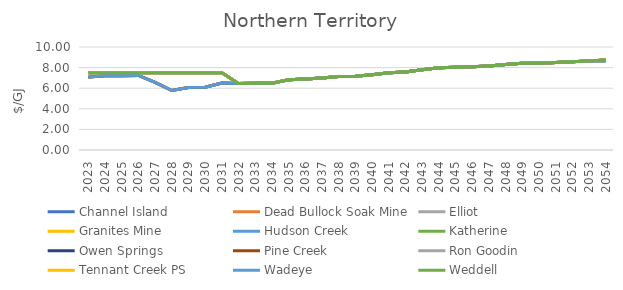
| Category | Channel Island | Dead Bullock Soak Mine | Elliot | Granites Mine | Hudson Creek | Katherine | Owen Springs | Pine Creek | Ron Goodin | Tennant Creek PS | Wadeye | Weddell |
|---|---|---|---|---|---|---|---|---|---|---|---|---|
| 2023.0 | 7.5 | 7.075 | 7.075 | 7.075 | 7.075 | 7.5 | 7.5 | 7.075 | 7.5 | 7.5 | 7.075 | 7.5 |
| 2024.0 | 7.5 | 7.209 | 7.209 | 7.209 | 7.209 | 7.5 | 7.5 | 7.209 | 7.5 | 7.5 | 7.209 | 7.5 |
| 2025.0 | 7.5 | 7.206 | 7.206 | 7.206 | 7.206 | 7.5 | 7.5 | 7.206 | 7.5 | 7.5 | 7.206 | 7.5 |
| 2026.0 | 7.5 | 7.235 | 7.235 | 7.235 | 7.235 | 7.5 | 7.5 | 7.235 | 7.5 | 7.5 | 7.235 | 7.5 |
| 2027.0 | 7.5 | 6.574 | 6.574 | 6.574 | 6.574 | 7.5 | 7.5 | 6.574 | 7.5 | 7.5 | 6.574 | 7.5 |
| 2028.0 | 7.5 | 5.778 | 5.778 | 5.778 | 5.778 | 7.5 | 7.5 | 5.778 | 7.5 | 7.5 | 5.778 | 7.5 |
| 2029.0 | 7.5 | 6.058 | 6.058 | 6.058 | 6.058 | 7.5 | 7.5 | 6.058 | 7.5 | 7.5 | 6.058 | 7.5 |
| 2030.0 | 7.5 | 6.086 | 6.086 | 6.086 | 6.086 | 7.5 | 7.5 | 6.086 | 7.5 | 7.5 | 6.086 | 7.5 |
| 2031.0 | 7.5 | 6.501 | 6.501 | 6.501 | 6.501 | 7.5 | 7.5 | 6.501 | 7.5 | 7.5 | 6.501 | 7.5 |
| 2032.0 | 6.461 | 6.461 | 6.461 | 6.461 | 6.461 | 6.461 | 6.461 | 6.461 | 6.461 | 6.461 | 6.461 | 6.461 |
| 2033.0 | 6.474 | 6.474 | 6.474 | 6.474 | 6.474 | 6.474 | 6.474 | 6.474 | 6.474 | 6.474 | 6.474 | 6.474 |
| 2034.0 | 6.492 | 6.492 | 6.492 | 6.492 | 6.492 | 6.492 | 6.492 | 6.492 | 6.492 | 6.492 | 6.492 | 6.492 |
| 2035.0 | 6.823 | 6.823 | 6.823 | 6.823 | 6.823 | 6.823 | 6.823 | 6.823 | 6.823 | 6.823 | 6.823 | 6.823 |
| 2036.0 | 6.9 | 6.9 | 6.9 | 6.9 | 6.9 | 6.9 | 6.9 | 6.9 | 6.9 | 6.9 | 6.9 | 6.9 |
| 2037.0 | 7.001 | 7.001 | 7.001 | 7.001 | 7.001 | 7.001 | 7.001 | 7.001 | 7.001 | 7.001 | 7.001 | 7.001 |
| 2038.0 | 7.128 | 7.128 | 7.128 | 7.128 | 7.128 | 7.128 | 7.128 | 7.128 | 7.128 | 7.128 | 7.128 | 7.128 |
| 2039.0 | 7.169 | 7.169 | 7.169 | 7.169 | 7.169 | 7.169 | 7.169 | 7.169 | 7.169 | 7.169 | 7.169 | 7.169 |
| 2040.0 | 7.308 | 7.308 | 7.308 | 7.308 | 7.308 | 7.308 | 7.308 | 7.308 | 7.308 | 7.308 | 7.308 | 7.308 |
| 2041.0 | 7.495 | 7.495 | 7.495 | 7.495 | 7.495 | 7.495 | 7.495 | 7.495 | 7.495 | 7.495 | 7.495 | 7.495 |
| 2042.0 | 7.568 | 7.568 | 7.568 | 7.568 | 7.568 | 7.568 | 7.568 | 7.568 | 7.568 | 7.568 | 7.568 | 7.568 |
| 2043.0 | 7.79 | 7.79 | 7.79 | 7.79 | 7.79 | 7.79 | 7.79 | 7.79 | 7.79 | 7.79 | 7.79 | 7.79 |
| 2044.0 | 7.979 | 7.979 | 7.979 | 7.979 | 7.979 | 7.979 | 7.979 | 7.979 | 7.979 | 7.979 | 7.979 | 7.979 |
| 2045.0 | 8.03 | 8.03 | 8.03 | 8.03 | 8.03 | 8.03 | 8.03 | 8.03 | 8.03 | 8.03 | 8.03 | 8.03 |
| 2046.0 | 8.082 | 8.082 | 8.082 | 8.082 | 8.082 | 8.082 | 8.082 | 8.082 | 8.082 | 8.082 | 8.082 | 8.082 |
| 2047.0 | 8.145 | 8.145 | 8.145 | 8.145 | 8.145 | 8.145 | 8.145 | 8.145 | 8.145 | 8.145 | 8.145 | 8.145 |
| 2048.0 | 8.303 | 8.303 | 8.303 | 8.303 | 8.303 | 8.303 | 8.303 | 8.303 | 8.303 | 8.303 | 8.303 | 8.303 |
| 2049.0 | 8.414 | 8.414 | 8.414 | 8.414 | 8.414 | 8.414 | 8.414 | 8.414 | 8.414 | 8.414 | 8.414 | 8.414 |
| 2050.0 | 8.414 | 8.414 | 8.414 | 8.414 | 8.414 | 8.414 | 8.414 | 8.414 | 8.414 | 8.414 | 8.414 | 8.414 |
| 2051.0 | 8.493 | 8.493 | 8.493 | 8.493 | 8.493 | 8.493 | 8.493 | 8.493 | 8.493 | 8.493 | 8.493 | 8.493 |
| 2052.0 | 8.572 | 8.572 | 8.572 | 8.572 | 8.572 | 8.572 | 8.572 | 8.572 | 8.572 | 8.572 | 8.572 | 8.572 |
| 2053.0 | 8.653 | 8.653 | 8.653 | 8.653 | 8.653 | 8.653 | 8.653 | 8.653 | 8.653 | 8.653 | 8.653 | 8.653 |
| 2054.0 | 8.734 | 8.734 | 8.734 | 8.734 | 8.734 | 8.734 | 8.734 | 8.653 | 8.734 | 8.734 | 8.653 | 8.734 |